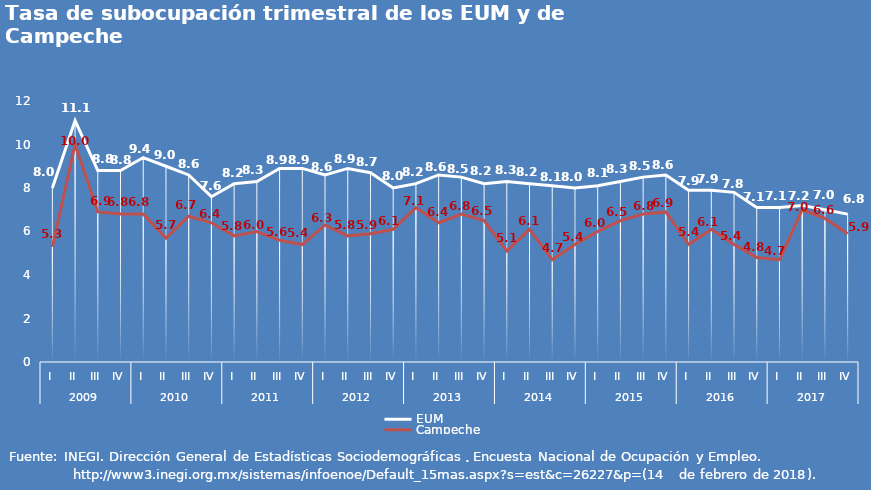
| Category | EUM | Campeche |
|---|---|---|
| 0 | 8 | 5.3 |
| 1 | 11.1 | 10 |
| 2 | 8.8 | 6.9 |
| 3 | 8.8 | 6.8 |
| 4 | 9.4 | 6.8 |
| 5 | 9 | 5.7 |
| 6 | 8.6 | 6.7 |
| 7 | 7.6 | 6.4 |
| 8 | 8.2 | 5.8 |
| 9 | 8.3 | 6 |
| 10 | 8.9 | 5.6 |
| 11 | 8.9 | 5.4 |
| 12 | 8.6 | 6.3 |
| 13 | 8.9 | 5.8 |
| 14 | 8.7 | 5.9 |
| 15 | 8 | 6.1 |
| 16 | 8.2 | 7.1 |
| 17 | 8.6 | 6.4 |
| 18 | 8.5 | 6.8 |
| 19 | 8.2 | 6.5 |
| 20 | 8.3 | 5.1 |
| 21 | 8.2 | 6.1 |
| 22 | 8.1 | 4.7 |
| 23 | 8 | 5.4 |
| 24 | 8.1 | 6 |
| 25 | 8.3 | 6.5 |
| 26 | 8.5 | 6.8 |
| 27 | 8.6 | 6.9 |
| 28 | 7.9 | 5.4 |
| 29 | 7.9 | 6.1 |
| 30 | 7.8 | 5.4 |
| 31 | 7.1 | 4.8 |
| 32 | 7.1 | 4.7 |
| 33 | 7.2 | 7 |
| 34 | 7 | 6.6 |
| 35 | 6.8 | 5.9 |